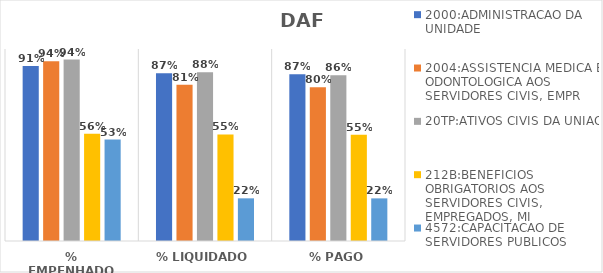
| Category | 2000:ADMINISTRACAO DA UNIDADE | 2004:ASSISTENCIA MEDICA E ODONTOLOGICA AOS SERVIDORES CIVIS, EMPR | 20TP:ATIVOS CIVIS DA UNIAO | 212B:BENEFICIOS OBRIGATORIOS AOS SERVIDORES CIVIS, EMPREGADOS, MI | 4572:CAPACITACAO DE SERVIDORES PUBLICOS FEDERAIS EM PROCESSO DE Q |
|---|---|---|---|---|---|
| % EMPENHADO | 0.911 | 0.936 | 0.945 | 0.559 | 0.528 |
| % LIQUIDADO | 0.874 | 0.814 | 0.879 | 0.555 | 0.222 |
| % PAGO | 0.869 | 0.801 | 0.864 | 0.554 | 0.222 |